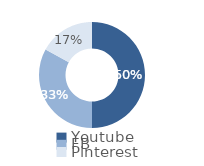
| Category | Series 0 |
|---|---|
| Youtube | 0.5 |
| FB | 0.33 |
| Pinterest | 0.17 |